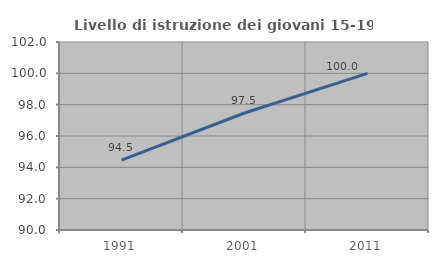
| Category | Livello di istruzione dei giovani 15-19 anni |
|---|---|
| 1991.0 | 94.465 |
| 2001.0 | 97.468 |
| 2011.0 | 100 |